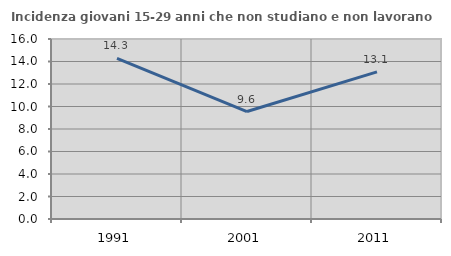
| Category | Incidenza giovani 15-29 anni che non studiano e non lavorano  |
|---|---|
| 1991.0 | 14.286 |
| 2001.0 | 9.554 |
| 2011.0 | 13.076 |